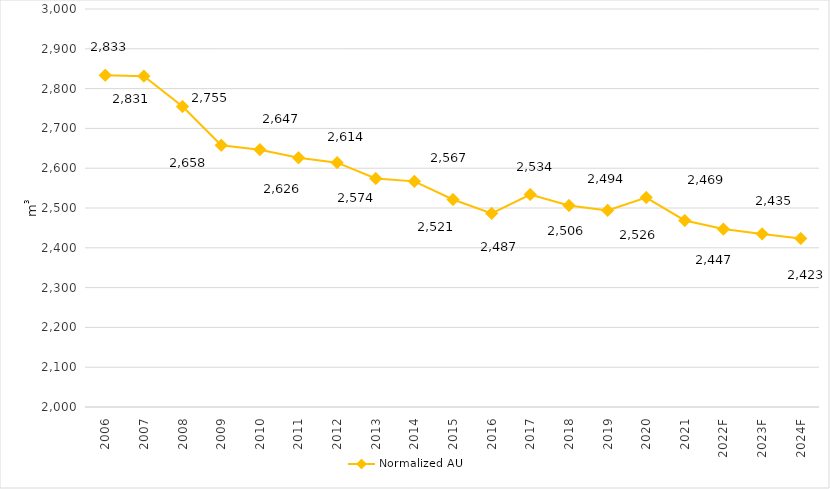
| Category | Normalized AU |
|---|---|
| 2006 | 2833.432 |
| 2007 | 2831.257 |
| 2008 | 2754.973 |
| 2009 | 2657.673 |
| 2010 | 2646.545 |
| 2011 | 2626.253 |
| 2012 | 2613.875 |
| 2013 | 2574.375 |
| 2014 | 2566.924 |
| 2015 | 2521.394 |
| 2016 | 2486.63 |
| 2017 | 2533.696 |
| 2018 | 2506.272 |
| 2019 | 2494.051 |
| 2020 | 2526.34 |
| 2021 | 2468.637 |
| 2022F | 2447.063 |
| 2023F | 2434.881 |
| 2024F | 2423.412 |